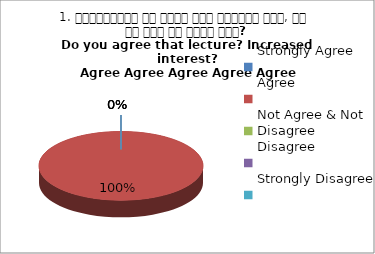
| Category | 1. व्याख्यान से रूचि में वृद्धि हुई, आप इस बात से सहमत हैं?
Do you agree that lecture? Increased interest?
 Agree Agree Agree Agree Agree |
|---|---|
| Strongly Agree | 0 |
| Agree | 4 |
| Not Agree & Not Disagree | 0 |
| Disagree | 0 |
| Strongly Disagree | 0 |